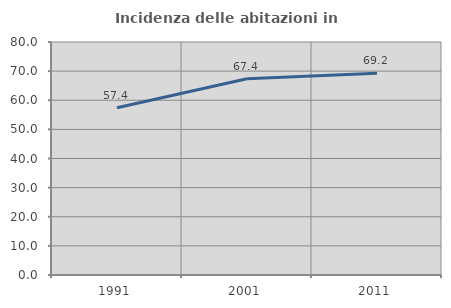
| Category | Incidenza delle abitazioni in proprietà  |
|---|---|
| 1991.0 | 57.414 |
| 2001.0 | 67.401 |
| 2011.0 | 69.238 |